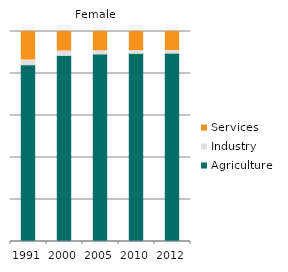
| Category | Agriculture | Industry | Services |
|---|---|---|---|
| 1991.0 | 84.157 | 2.247 | 13.596 |
| 2000.0 | 88.616 | 2.11 | 9.274 |
| 2005.0 | 89.29 | 1.551 | 9.159 |
| 2010.0 | 89.582 | 1.333 | 9.085 |
| 2012.0 | 89.671 | 1.268 | 9.061 |